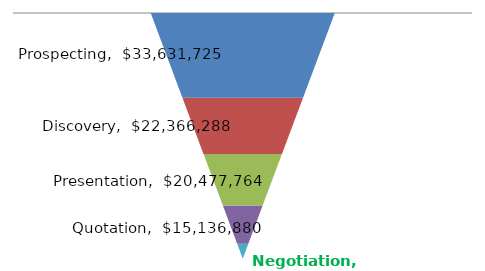
| Category | Prospecting | Discovery | Presentation | Quotation | Negotiation |
|---|---|---|---|---|---|
| # of Deals | 33631725 | 22366288 | 20477763.6 | 15136880.07 | 5678495 |